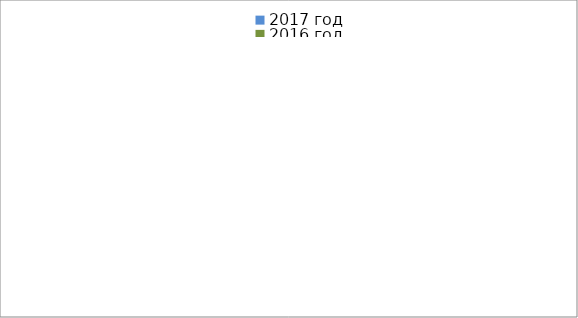
| Category | 2017 год | 2016 год |
|---|---|---|
|  - поджог | 13 | 34 |
|  - неосторожное обращение с огнём | 5 | 21 |
|  - НПТЭ электрооборудования | 14 | 17 |
|  - НПУ и Э печей | 37 | 30 |
|  - НПУ и Э транспортных средств | 43 | 22 |
|   -Шалость с огнем детей | 3 | 5 |
|  -НППБ при эксплуатации эл.приборов | 21 | 8 |
|  - курение | 29 | 14 |
| - прочие | 62 | 68 |
| - не установленные причины | 0 | 11 |